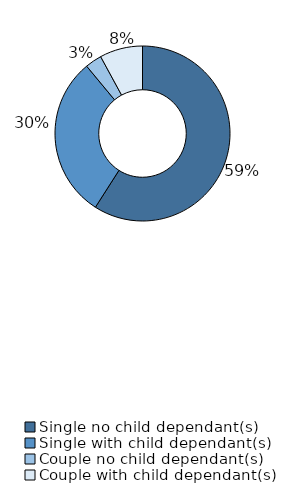
| Category | Series 0 |
|---|---|
| Single no child dependant(s) | 0.59 |
| Single with child dependant(s) | 0.299 |
| Couple no child dependant(s) | 0.031 |
| Couple with child dependant(s) | 0.079 |